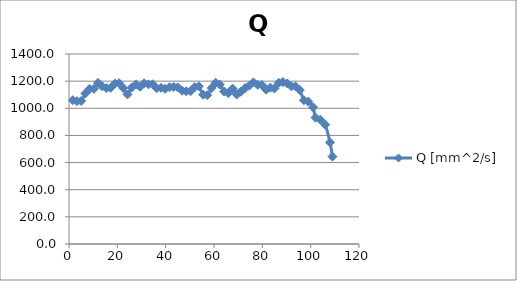
| Category | Q [mm^2/s] |
|---|---|
| 1.57 | 1059.556 |
| 3.3 | 1052.444 |
| 5.04 | 1053.867 |
| 6.78 | 1109.333 |
| 8.52 | 1143.111 |
| 10.3 | 1143.111 |
| 12.0 | 1187.022 |
| 13.7 | 1162.133 |
| 15.5 | 1148.444 |
| 17.2 | 1150.756 |
| 19.0 | 1182.044 |
| 20.7 | 1185.422 |
| 22.4 | 1149.867 |
| 24.2 | 1101.867 |
| 25.9 | 1152.178 |
| 27.7 | 1176.356 |
| 29.4 | 1158.222 |
| 31.1 | 1183.822 |
| 32.9 | 1176.178 |
| 34.6 | 1177.422 |
| 36.3 | 1148.444 |
| 38.1 | 1150.756 |
| 39.8 | 1143.467 |
| 41.6 | 1155.022 |
| 43.3 | 1157.333 |
| 45.0 | 1153.956 |
| 46.8 | 1129.244 |
| 48.5 | 1125.689 |
| 50.3 | 1125.906 |
| 52.0 | 1155.733 |
| 53.7 | 1161.6 |
| 55.5 | 1099.556 |
| 57.2 | 1097.067 |
| 59.0 | 1148.978 |
| 60.7 | 1188.267 |
| 62.4 | 1174.4 |
| 64.2 | 1123.2 |
| 65.9 | 1111.502 |
| 67.7 | 1145.067 |
| 69.4 | 1101.511 |
| 71.1 | 1122.133 |
| 72.9 | 1149.156 |
| 74.6 | 1166.578 |
| 76.3 | 1190.578 |
| 78.1 | 1173.156 |
| 79.8 | 1172.089 |
| 81.6 | 1137.067 |
| 83.3 | 1152 |
| 85.0 | 1145.6 |
| 86.8 | 1187.556 |
| 88.5 | 1192.889 |
| 90.3 | 1183.289 |
| 92.0 | 1161.778 |
| 93.7 | 1161.6 |
| 95.5 | 1134.578 |
| 97.2 | 1059.022 |
| 99.0 | 1049.778 |
| 101.0 | 1007.822 |
| 102.0 | 931.556 |
| 104.0 | 915.911 |
| 106.0 | 879.822 |
| 108.0 | 749.156 |
| 109.0 | 644.089 |